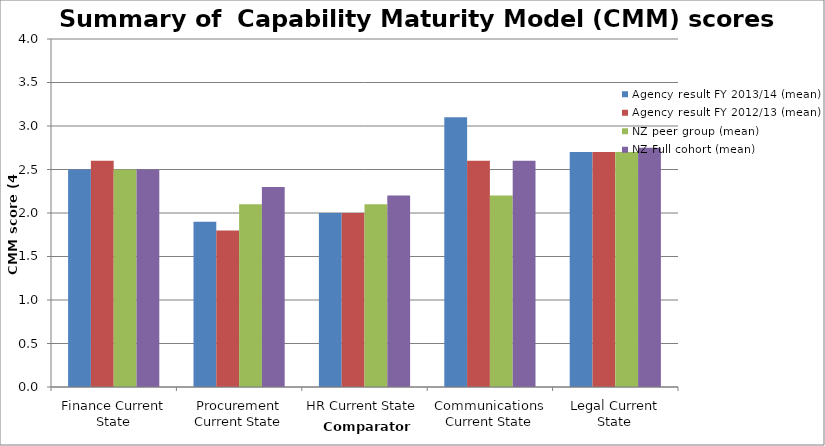
| Category | Agency result FY 2013/14 (mean) | Agency result FY 2012/13 (mean) | NZ peer group (mean) | NZ Full cohort (mean) |
|---|---|---|---|---|
| Finance Current State | 2.5 | 2.6 | 2.5 | 2.5 |
| Procurement Current State | 1.9 | 1.8 | 2.1 | 2.3 |
| HR Current State | 2 | 2 | 2.1 | 2.2 |
| Communications Current State | 3.1 | 2.6 | 2.2 | 2.6 |
| Legal Current State | 2.7 | 2.7 | 2.7 | 2.75 |